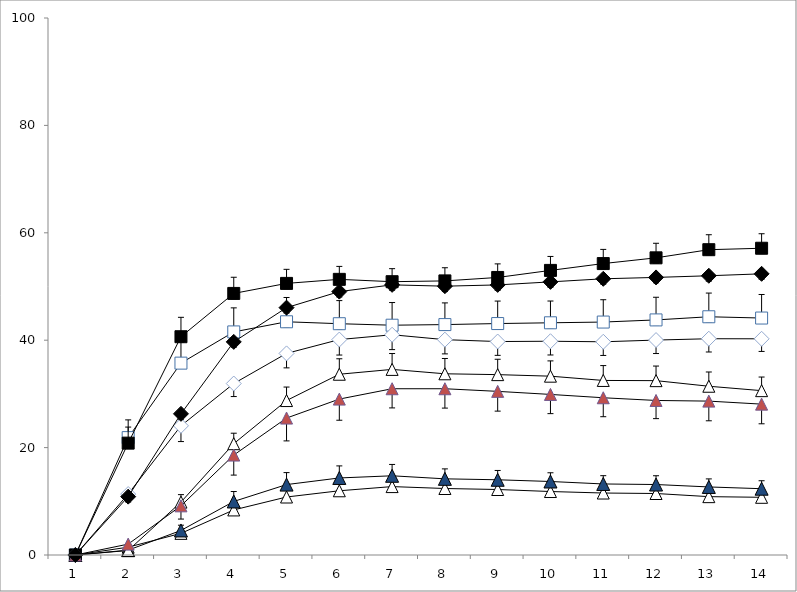
| Category | 5HT control | 5HT sensibilizado | MDLCONTROL | MDLsensibilizado | RS1021 control | RS10221sensibilizado | RS127445 control | RS127445 sensibilizado |
|---|---|---|---|---|---|---|---|---|
| 0 | 0 | 0 | 0 | 0 | 0 | 0 | 0 | 0 |
| 1 | 21.859 | 20.83 | 1.459 | 0.901 | 0.839 | 2.025 | 11.348 | 10.867 |
| 2 | 35.73 | 40.647 | 4.032 | 4.57 | 9.852 | 9.154 | 24.056 | 26.29 |
| 3 | 41.544 | 48.71 | 8.394 | 9.969 | 20.728 | 18.608 | 31.926 | 39.685 |
| 4 | 43.431 | 50.579 | 10.8 | 13.114 | 28.76 | 25.499 | 37.539 | 46.063 |
| 5 | 43.071 | 51.331 | 11.96 | 14.347 | 33.662 | 29.035 | 40.117 | 49.049 |
| 6 | 42.792 | 50.895 | 12.74 | 14.75 | 34.564 | 30.96 | 41.017 | 50.308 |
| 7 | 42.908 | 51.043 | 12.381 | 14.182 | 33.746 | 30.959 | 40.1 | 50.06 |
| 8 | 43.1 | 51.684 | 12.197 | 14.009 | 33.589 | 30.473 | 39.751 | 50.295 |
| 9 | 43.241 | 52.999 | 11.821 | 13.688 | 33.301 | 29.901 | 39.807 | 50.86 |
| 10 | 43.378 | 54.271 | 11.54 | 13.228 | 32.507 | 29.282 | 39.705 | 51.435 |
| 11 | 43.777 | 55.339 | 11.451 | 13.124 | 32.468 | 28.779 | 40.025 | 51.691 |
| 12 | 44.366 | 56.853 | 10.867 | 12.672 | 31.427 | 28.657 | 40.274 | 52 |
| 13 | 44.127 | 57.124 | 10.743 | 12.344 | 30.606 | 28.094 | 40.26 | 52.361 |